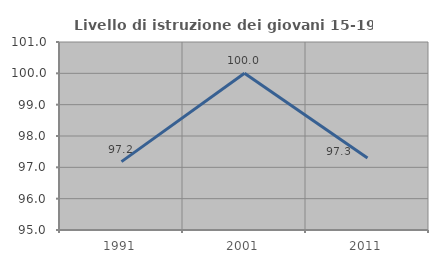
| Category | Livello di istruzione dei giovani 15-19 anni |
|---|---|
| 1991.0 | 97.183 |
| 2001.0 | 100 |
| 2011.0 | 97.297 |